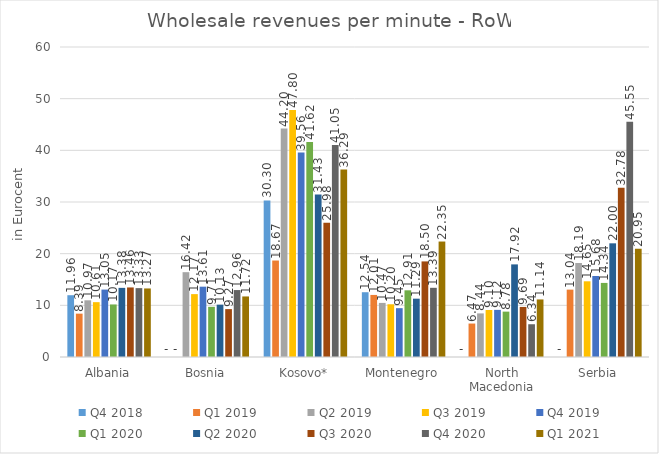
| Category | Q4 2018 | Q1 2019 | Q2 2019 | Q3 2019 | Q4 2019 | Q1 2020 | Q2 2020 | Q3 2020 | Q4 2020 | Q1 2021 |
|---|---|---|---|---|---|---|---|---|---|---|
| Albania | 11.959 | 8.39 | 10.973 | 10.613 | 13.047 | 10.168 | 13.381 | 13.462 | 13.331 | 13.267 |
| Bosnia | 0 | 0 | 16.417 | 12.171 | 13.61 | 9.712 | 10.129 | 9.269 | 12.957 | 11.719 |
| Kosovo* | 30.297 | 18.674 | 44.202 | 47.805 | 39.558 | 41.623 | 31.428 | 25.983 | 41.054 | 36.287 |
| Montenegro | 12.538 | 12.013 | 10.47 | 10.203 | 9.451 | 12.908 | 11.29 | 18.501 | 13.392 | 22.348 |
| North Macedonia | 0 | 6.475 | 8.439 | 9.101 | 9.122 | 8.783 | 17.924 | 9.69 | 6.34 | 11.14 |
| Serbia | 0 | 13.041 | 18.191 | 14.652 | 15.682 | 14.339 | 22.002 | 32.778 | 45.549 | 20.951 |